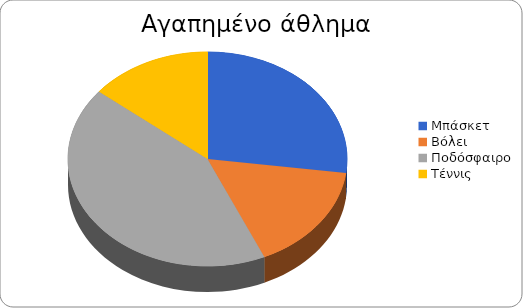
| Category | ΣΥΝΟΛΟ |
|---|---|
| Μπάσκετ | 65 |
| Βόλει | 39 |
| Ποδόσφαιρο | 102 |
| Τέννις | 34 |